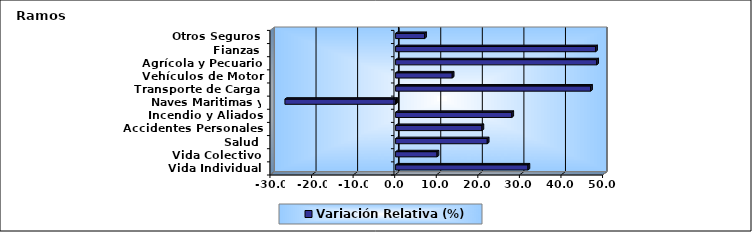
| Category | Variación Relativa (%) |
|---|---|
| Vida Individual | 31.841 |
| Vida Colectivo | 9.97 |
| Salud | 22.047 |
| Accidentes Personales | 20.775 |
| Incendio y Aliados | 27.956 |
| Naves Maritimas y Aéreas | -26.625 |
| Transporte de Carga | 46.902 |
| Vehículos de Motor | 13.62 |
| Agrícola y Pecuario | 48.379 |
| Fianzas | 48.118 |
| Otros Seguros | 6.973 |